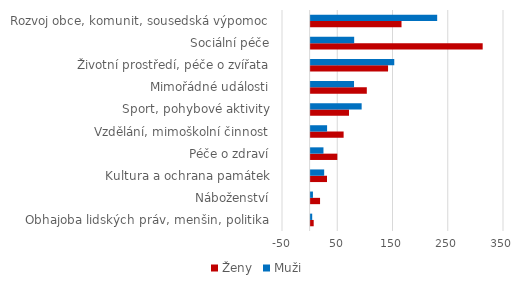
| Category | Ženy | Muži |
|---|---|---|
| Obhajoba lidských práv, menšin, politika | 5.545 | 2.857 |
| Náboženství | 17.067 | 4.192 |
| Kultura a ochrana památek | 29.67 | 24.512 |
| Péče o zdraví | 48.333 | 23.238 |
| Vzdělání, mimoškolní činnost | 59.716 | 29.796 |
| Sport, pohybové aktivity | 69.445 | 92.355 |
| Mimořádné události | 101.692 | 78.549 |
| Životní prostředí, péče o zvířata | 140.153 | 151.384 |
| Sociální péče | 311.415 | 78.837 |
| Rozvoj obce, komunit, sousedská výpomoc | 164.506 | 229.057 |